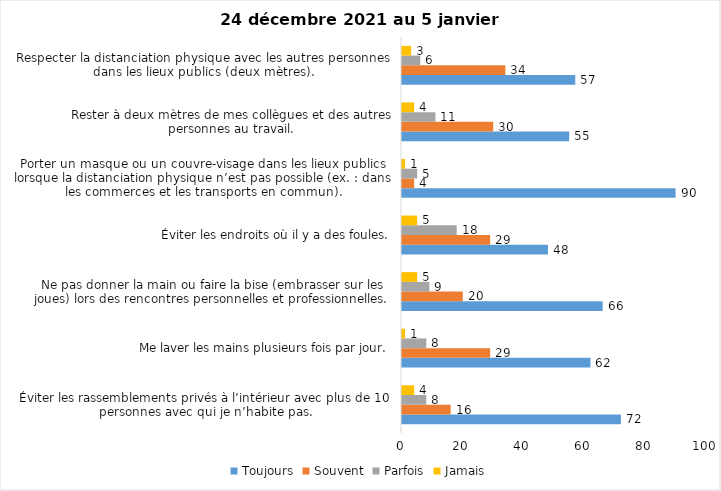
| Category | Toujours | Souvent | Parfois | Jamais |
|---|---|---|---|---|
| Éviter les rassemblements privés à l’intérieur avec plus de 10 personnes avec qui je n’habite pas. | 72 | 16 | 8 | 4 |
| Me laver les mains plusieurs fois par jour. | 62 | 29 | 8 | 1 |
| Ne pas donner la main ou faire la bise (embrasser sur les joues) lors des rencontres personnelles et professionnelles. | 66 | 20 | 9 | 5 |
| Éviter les endroits où il y a des foules. | 48 | 29 | 18 | 5 |
| Porter un masque ou un couvre-visage dans les lieux publics lorsque la distanciation physique n’est pas possible (ex. : dans les commerces et les transports en commun). | 90 | 4 | 5 | 1 |
| Rester à deux mètres de mes collègues et des autres personnes au travail. | 55 | 30 | 11 | 4 |
| Respecter la distanciation physique avec les autres personnes dans les lieux publics (deux mètres). | 57 | 34 | 6 | 3 |